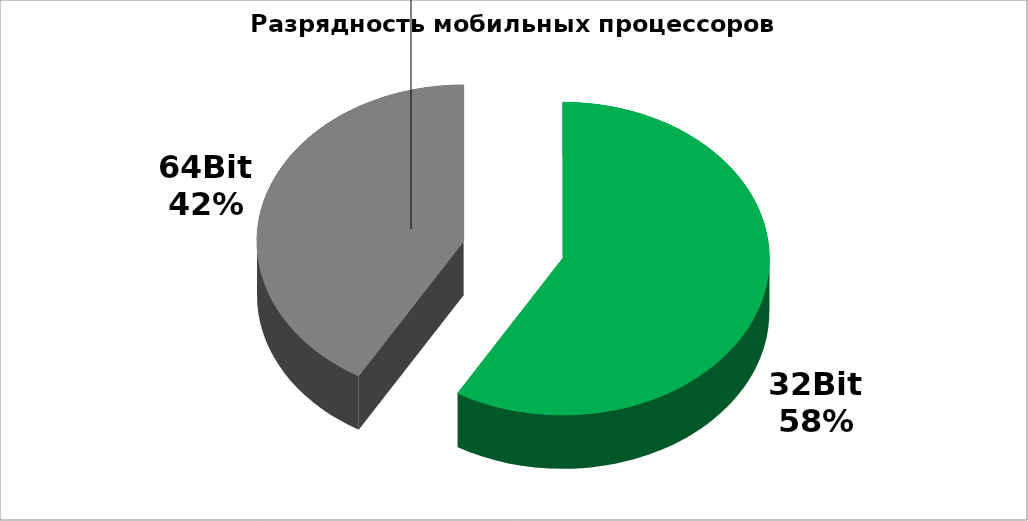
| Category | Series 0 |
|---|---|
| 32Bit | 69 |
| 64Bit | 49 |